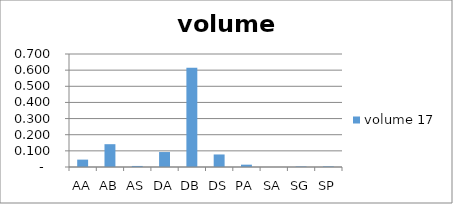
| Category |  volume 17  |
|---|---|
| AA | 0.046 |
| AB | 0.141 |
| AS | 0.006 |
| DA | 0.093 |
| DB | 0.615 |
| DS | 0.078 |
| PA | 0.014 |
| SA | 0 |
| SG | 0.003 |
| SP | 0.004 |